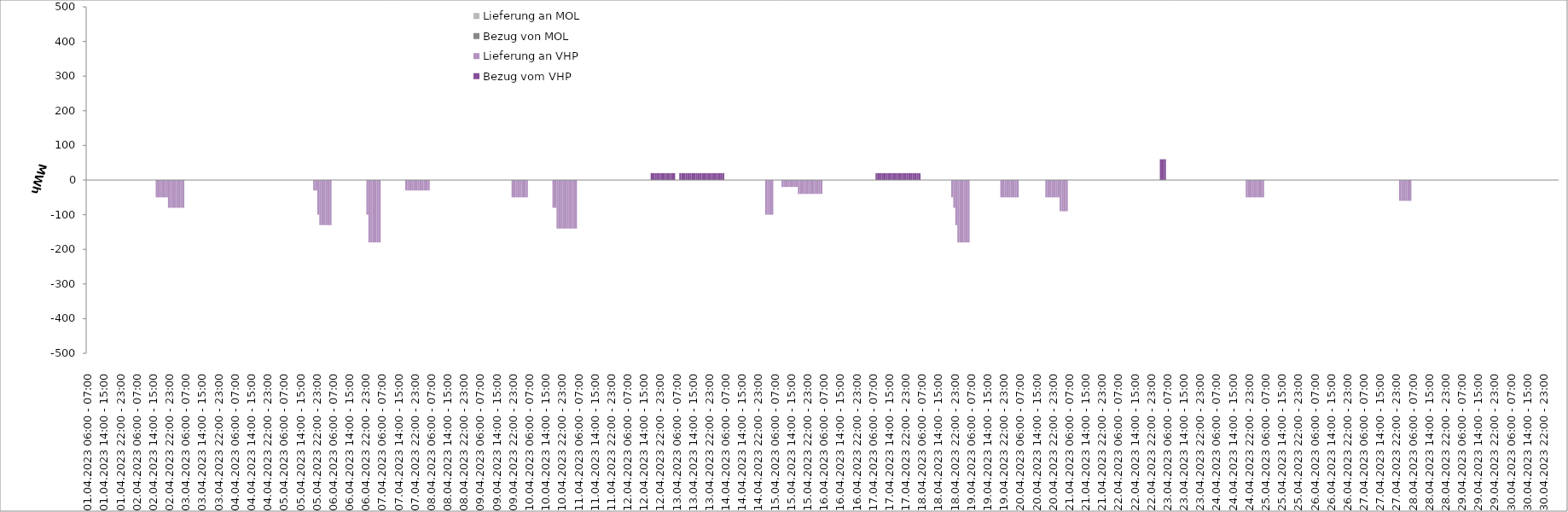
| Category | Bezug vom VHP | Lieferung an VHP | Bezug von MOL | Lieferung an MOL |
|---|---|---|---|---|
| 01.04.2023 06:00 - 07:00 | 0 | 0 | 0 | 0 |
| 01.04.2023 07:00 - 08:00 | 0 | 0 | 0 | 0 |
| 01.04.2023 08:00 - 09:00 | 0 | 0 | 0 | 0 |
| 01.04.2023 09:00 - 10:00 | 0 | 0 | 0 | 0 |
| 01.04.2023 10:00 - 11:00 | 0 | 0 | 0 | 0 |
| 01.04.2023 11:00 - 12:00 | 0 | 0 | 0 | 0 |
| 01.04.2023 12:00 - 13:00 | 0 | 0 | 0 | 0 |
| 01.04.2023 13:00 - 14:00 | 0 | 0 | 0 | 0 |
| 01.04.2023 14:00 - 15:00 | 0 | 0 | 0 | 0 |
| 01.04.2023 15:00 - 16:00 | 0 | 0 | 0 | 0 |
| 01.04.2023 16:00 - 17:00 | 0 | 0 | 0 | 0 |
| 01.04.2023 17:00 - 18:00 | 0 | 0 | 0 | 0 |
| 01.04.2023 18:00 - 19:00 | 0 | 0 | 0 | 0 |
| 01.04.2023 19:00 - 20:00 | 0 | 0 | 0 | 0 |
| 01.04.2023 20:00 - 21:00 | 0 | 0 | 0 | 0 |
| 01.04.2023 21:00 - 22:00 | 0 | 0 | 0 | 0 |
| 01.04.2023 22:00 - 23:00 | 0 | 0 | 0 | 0 |
| 01.04.2023 23:00 - 24:00 | 0 | 0 | 0 | 0 |
| 02.04.2023 00:00 - 01:00 | 0 | 0 | 0 | 0 |
| 02.04.2023 01:00 - 02:00 | 0 | 0 | 0 | 0 |
| 02.04.2023 02:00 - 03:00 | 0 | 0 | 0 | 0 |
| 02.04.2023 03:00 - 04:00 | 0 | 0 | 0 | 0 |
| 02.04.2023 04:00 - 05:00 | 0 | 0 | 0 | 0 |
| 02.04.2023 05:00 - 06:00 | 0 | 0 | 0 | 0 |
| 02.04.2023 06:00 - 07:00 | 0 | 0 | 0 | 0 |
| 02.04.2023 07:00 - 08:00 | 0 | 0 | 0 | 0 |
| 02.04.2023 08:00 - 09:00 | 0 | 0 | 0 | 0 |
| 02.04.2023 09:00 - 10:00 | 0 | 0 | 0 | 0 |
| 02.04.2023 10:00 - 11:00 | 0 | 0 | 0 | 0 |
| 02.04.2023 11:00 - 12:00 | 0 | 0 | 0 | 0 |
| 02.04.2023 12:00 - 13:00 | 0 | 0 | 0 | 0 |
| 02.04.2023 13:00 - 14:00 | 0 | 0 | 0 | 0 |
| 02.04.2023 14:00 - 15:00 | 0 | 0 | 0 | 0 |
| 02.04.2023 15:00 - 16:00 | 0 | 0 | 0 | 0 |
| 02.04.2023 16:00 - 17:00 | 0 | -50 | 0 | 0 |
| 02.04.2023 17:00 - 18:00 | 0 | -50 | 0 | 0 |
| 02.04.2023 18:00 - 19:00 | 0 | -50 | 0 | 0 |
| 02.04.2023 19:00 - 20:00 | 0 | -50 | 0 | 0 |
| 02.04.2023 20:00 - 21:00 | 0 | -50 | 0 | 0 |
| 02.04.2023 21:00 - 22:00 | 0 | -50 | 0 | 0 |
| 02.04.2023 22:00 - 23:00 | 0 | -80 | 0 | 0 |
| 02.04.2023 23:00 - 24:00 | 0 | -80 | 0 | 0 |
| 03.04.2023 00:00 - 01:00 | 0 | -80 | 0 | 0 |
| 03.04.2023 01:00 - 02:00 | 0 | -80 | 0 | 0 |
| 03.04.2023 02:00 - 03:00 | 0 | -80 | 0 | 0 |
| 03.04.2023 03:00 - 04:00 | 0 | -80 | 0 | 0 |
| 03.04.2023 04:00 - 05:00 | 0 | -80 | 0 | 0 |
| 03.04.2023 05:00 - 06:00 | 0 | -80 | 0 | 0 |
| 03.04.2023 06:00 - 07:00 | 0 | 0 | 0 | 0 |
| 03.04.2023 07:00 - 08:00 | 0 | 0 | 0 | 0 |
| 03.04.2023 08:00 - 09:00 | 0 | 0 | 0 | 0 |
| 03.04.2023 09:00 - 10:00 | 0 | 0 | 0 | 0 |
| 03.04.2023 10:00 - 11:00 | 0 | 0 | 0 | 0 |
| 03.04.2023 11:00 - 12:00 | 0 | 0 | 0 | 0 |
| 03.04.2023 12:00 - 13:00 | 0 | 0 | 0 | 0 |
| 03.04.2023 13:00 - 14:00 | 0 | 0 | 0 | 0 |
| 03.04.2023 14:00 - 15:00 | 0 | 0 | 0 | 0 |
| 03.04.2023 15:00 - 16:00 | 0 | 0 | 0 | 0 |
| 03.04.2023 16:00 - 17:00 | 0 | 0 | 0 | 0 |
| 03.04.2023 17:00 - 18:00 | 0 | 0 | 0 | 0 |
| 03.04.2023 18:00 - 19:00 | 0 | 0 | 0 | 0 |
| 03.04.2023 19:00 - 20:00 | 0 | 0 | 0 | 0 |
| 03.04.2023 20:00 - 21:00 | 0 | 0 | 0 | 0 |
| 03.04.2023 21:00 - 22:00 | 0 | 0 | 0 | 0 |
| 03.04.2023 22:00 - 23:00 | 0 | 0 | 0 | 0 |
| 03.04.2023 23:00 - 24:00 | 0 | 0 | 0 | 0 |
| 04.04.2023 00:00 - 01:00 | 0 | 0 | 0 | 0 |
| 04.04.2023 01:00 - 02:00 | 0 | 0 | 0 | 0 |
| 04.04.2023 02:00 - 03:00 | 0 | 0 | 0 | 0 |
| 04.04.2023 03:00 - 04:00 | 0 | 0 | 0 | 0 |
| 04.04.2023 04:00 - 05:00 | 0 | 0 | 0 | 0 |
| 04.04.2023 05:00 - 06:00 | 0 | 0 | 0 | 0 |
| 04.04.2023 06:00 - 07:00 | 0 | 0 | 0 | 0 |
| 04.04.2023 07:00 - 08:00 | 0 | 0 | 0 | 0 |
| 04.04.2023 08:00 - 09:00 | 0 | 0 | 0 | 0 |
| 04.04.2023 09:00 - 10:00 | 0 | 0 | 0 | 0 |
| 04.04.2023 10:00 - 11:00 | 0 | 0 | 0 | 0 |
| 04.04.2023 11:00 - 12:00 | 0 | 0 | 0 | 0 |
| 04.04.2023 12:00 - 13:00 | 0 | 0 | 0 | 0 |
| 04.04.2023 13:00 - 14:00 | 0 | 0 | 0 | 0 |
| 04.04.2023 14:00 - 15:00 | 0 | 0 | 0 | 0 |
| 04.04.2023 15:00 - 16:00 | 0 | 0 | 0 | 0 |
| 04.04.2023 16:00 - 17:00 | 0 | 0 | 0 | 0 |
| 04.04.2023 17:00 - 18:00 | 0 | 0 | 0 | 0 |
| 04.04.2023 18:00 - 19:00 | 0 | 0 | 0 | 0 |
| 04.04.2023 19:00 - 20:00 | 0 | 0 | 0 | 0 |
| 04.04.2023 20:00 - 21:00 | 0 | 0 | 0 | 0 |
| 04.04.2023 21:00 - 22:00 | 0 | 0 | 0 | 0 |
| 04.04.2023 22:00 - 23:00 | 0 | 0 | 0 | 0 |
| 04.04.2023 23:00 - 24:00 | 0 | 0 | 0 | 0 |
| 05.04.2023 00:00 - 01:00 | 0 | 0 | 0 | 0 |
| 05.04.2023 01:00 - 02:00 | 0 | 0 | 0 | 0 |
| 05.04.2023 02:00 - 03:00 | 0 | 0 | 0 | 0 |
| 05.04.2023 03:00 - 04:00 | 0 | 0 | 0 | 0 |
| 05.04.2023 04:00 - 05:00 | 0 | 0 | 0 | 0 |
| 05.04.2023 05:00 - 06:00 | 0 | 0 | 0 | 0 |
| 05.04.2023 06:00 - 07:00 | 0 | 0 | 0 | 0 |
| 05.04.2023 07:00 - 08:00 | 0 | 0 | 0 | 0 |
| 05.04.2023 08:00 - 09:00 | 0 | 0 | 0 | 0 |
| 05.04.2023 09:00 - 10:00 | 0 | 0 | 0 | 0 |
| 05.04.2023 10:00 - 11:00 | 0 | 0 | 0 | 0 |
| 05.04.2023 11:00 - 12:00 | 0 | 0 | 0 | 0 |
| 05.04.2023 12:00 - 13:00 | 0 | 0 | 0 | 0 |
| 05.04.2023 13:00 - 14:00 | 0 | 0 | 0 | 0 |
| 05.04.2023 14:00 - 15:00 | 0 | 0 | 0 | 0 |
| 05.04.2023 15:00 - 16:00 | 0 | 0 | 0 | 0 |
| 05.04.2023 16:00 - 17:00 | 0 | 0 | 0 | 0 |
| 05.04.2023 17:00 - 18:00 | 0 | 0 | 0 | 0 |
| 05.04.2023 18:00 - 19:00 | 0 | 0 | 0 | 0 |
| 05.04.2023 19:00 - 20:00 | 0 | 0 | 0 | 0 |
| 05.04.2023 20:00 - 21:00 | 0 | 0 | 0 | 0 |
| 05.04.2023 21:00 - 22:00 | 0 | -30 | 0 | 0 |
| 05.04.2023 22:00 - 23:00 | 0 | -30 | 0 | 0 |
| 05.04.2023 23:00 - 24:00 | 0 | -100 | 0 | 0 |
| 06.04.2023 00:00 - 01:00 | 0 | -130 | 0 | 0 |
| 06.04.2023 01:00 - 02:00 | 0 | -130 | 0 | 0 |
| 06.04.2023 02:00 - 03:00 | 0 | -130 | 0 | 0 |
| 06.04.2023 03:00 - 04:00 | 0 | -130 | 0 | 0 |
| 06.04.2023 04:00 - 05:00 | 0 | -130 | 0 | 0 |
| 06.04.2023 05:00 - 06:00 | 0 | -130 | 0 | 0 |
| 06.04.2023 06:00 - 07:00 | 0 | 0 | 0 | 0 |
| 06.04.2023 07:00 - 08:00 | 0 | 0 | 0 | 0 |
| 06.04.2023 08:00 - 09:00 | 0 | 0 | 0 | 0 |
| 06.04.2023 09:00 - 10:00 | 0 | 0 | 0 | 0 |
| 06.04.2023 10:00 - 11:00 | 0 | 0 | 0 | 0 |
| 06.04.2023 11:00 - 12:00 | 0 | 0 | 0 | 0 |
| 06.04.2023 12:00 - 13:00 | 0 | 0 | 0 | 0 |
| 06.04.2023 13:00 - 14:00 | 0 | 0 | 0 | 0 |
| 06.04.2023 14:00 - 15:00 | 0 | 0 | 0 | 0 |
| 06.04.2023 15:00 - 16:00 | 0 | 0 | 0 | 0 |
| 06.04.2023 16:00 - 17:00 | 0 | 0 | 0 | 0 |
| 06.04.2023 17:00 - 18:00 | 0 | 0 | 0 | 0 |
| 06.04.2023 18:00 - 19:00 | 0 | 0 | 0 | 0 |
| 06.04.2023 19:00 - 20:00 | 0 | 0 | 0 | 0 |
| 06.04.2023 20:00 - 21:00 | 0 | 0 | 0 | 0 |
| 06.04.2023 21:00 - 22:00 | 0 | 0 | 0 | 0 |
| 06.04.2023 22:00 - 23:00 | 0 | 0 | 0 | 0 |
| 06.04.2023 23:00 - 24:00 | 0 | -100 | 0 | 0 |
| 07.04.2023 00:00 - 01:00 | 0 | -180 | 0 | 0 |
| 07.04.2023 01:00 - 02:00 | 0 | -180 | 0 | 0 |
| 07.04.2023 02:00 - 03:00 | 0 | -180 | 0 | 0 |
| 07.04.2023 03:00 - 04:00 | 0 | -180 | 0 | 0 |
| 07.04.2023 04:00 - 05:00 | 0 | -180 | 0 | 0 |
| 07.04.2023 05:00 - 06:00 | 0 | -180 | 0 | 0 |
| 07.04.2023 06:00 - 07:00 | 0 | 0 | 0 | 0 |
| 07.04.2023 07:00 - 08:00 | 0 | 0 | 0 | 0 |
| 07.04.2023 08:00 - 09:00 | 0 | 0 | 0 | 0 |
| 07.04.2023 09:00 - 10:00 | 0 | 0 | 0 | 0 |
| 07.04.2023 10:00 - 11:00 | 0 | 0 | 0 | 0 |
| 07.04.2023 11:00 - 12:00 | 0 | 0 | 0 | 0 |
| 07.04.2023 12:00 - 13:00 | 0 | 0 | 0 | 0 |
| 07.04.2023 13:00 - 14:00 | 0 | 0 | 0 | 0 |
| 07.04.2023 14:00 - 15:00 | 0 | 0 | 0 | 0 |
| 07.04.2023 15:00 - 16:00 | 0 | 0 | 0 | 0 |
| 07.04.2023 16:00 - 17:00 | 0 | 0 | 0 | 0 |
| 07.04.2023 17:00 - 18:00 | 0 | 0 | 0 | 0 |
| 07.04.2023 18:00 - 19:00 | 0 | -30 | 0 | 0 |
| 07.04.2023 19:00 - 20:00 | 0 | -30 | 0 | 0 |
| 07.04.2023 20:00 - 21:00 | 0 | -30 | 0 | 0 |
| 07.04.2023 21:00 - 22:00 | 0 | -30 | 0 | 0 |
| 07.04.2023 22:00 - 23:00 | 0 | -30 | 0 | 0 |
| 07.04.2023 23:00 - 24:00 | 0 | -30 | 0 | 0 |
| 08.04.2023 00:00 - 01:00 | 0 | -30 | 0 | 0 |
| 08.04.2023 01:00 - 02:00 | 0 | -30 | 0 | 0 |
| 08.04.2023 02:00 - 03:00 | 0 | -30 | 0 | 0 |
| 08.04.2023 03:00 - 04:00 | 0 | -30 | 0 | 0 |
| 08.04.2023 04:00 - 05:00 | 0 | -30 | 0 | 0 |
| 08.04.2023 05:00 - 06:00 | 0 | -30 | 0 | 0 |
| 08.04.2023 06:00 - 07:00 | 0 | 0 | 0 | 0 |
| 08.04.2023 07:00 - 08:00 | 0 | 0 | 0 | 0 |
| 08.04.2023 08:00 - 09:00 | 0 | 0 | 0 | 0 |
| 08.04.2023 09:00 - 10:00 | 0 | 0 | 0 | 0 |
| 08.04.2023 10:00 - 11:00 | 0 | 0 | 0 | 0 |
| 08.04.2023 11:00 - 12:00 | 0 | 0 | 0 | 0 |
| 08.04.2023 12:00 - 13:00 | 0 | 0 | 0 | 0 |
| 08.04.2023 13:00 - 14:00 | 0 | 0 | 0 | 0 |
| 08.04.2023 14:00 - 15:00 | 0 | 0 | 0 | 0 |
| 08.04.2023 15:00 - 16:00 | 0 | 0 | 0 | 0 |
| 08.04.2023 16:00 - 17:00 | 0 | 0 | 0 | 0 |
| 08.04.2023 17:00 - 18:00 | 0 | 0 | 0 | 0 |
| 08.04.2023 18:00 - 19:00 | 0 | 0 | 0 | 0 |
| 08.04.2023 19:00 - 20:00 | 0 | 0 | 0 | 0 |
| 08.04.2023 20:00 - 21:00 | 0 | 0 | 0 | 0 |
| 08.04.2023 21:00 - 22:00 | 0 | 0 | 0 | 0 |
| 08.04.2023 22:00 - 23:00 | 0 | 0 | 0 | 0 |
| 08.04.2023 23:00 - 24:00 | 0 | 0 | 0 | 0 |
| 09.04.2023 00:00 - 01:00 | 0 | 0 | 0 | 0 |
| 09.04.2023 01:00 - 02:00 | 0 | 0 | 0 | 0 |
| 09.04.2023 02:00 - 03:00 | 0 | 0 | 0 | 0 |
| 09.04.2023 03:00 - 04:00 | 0 | 0 | 0 | 0 |
| 09.04.2023 04:00 - 05:00 | 0 | 0 | 0 | 0 |
| 09.04.2023 05:00 - 06:00 | 0 | 0 | 0 | 0 |
| 09.04.2023 06:00 - 07:00 | 0 | 0 | 0 | 0 |
| 09.04.2023 07:00 - 08:00 | 0 | 0 | 0 | 0 |
| 09.04.2023 08:00 - 09:00 | 0 | 0 | 0 | 0 |
| 09.04.2023 09:00 - 10:00 | 0 | 0 | 0 | 0 |
| 09.04.2023 10:00 - 11:00 | 0 | 0 | 0 | 0 |
| 09.04.2023 11:00 - 12:00 | 0 | 0 | 0 | 0 |
| 09.04.2023 12:00 - 13:00 | 0 | 0 | 0 | 0 |
| 09.04.2023 13:00 - 14:00 | 0 | 0 | 0 | 0 |
| 09.04.2023 14:00 - 15:00 | 0 | 0 | 0 | 0 |
| 09.04.2023 15:00 - 16:00 | 0 | 0 | 0 | 0 |
| 09.04.2023 16:00 - 17:00 | 0 | 0 | 0 | 0 |
| 09.04.2023 17:00 - 18:00 | 0 | 0 | 0 | 0 |
| 09.04.2023 18:00 - 19:00 | 0 | 0 | 0 | 0 |
| 09.04.2023 19:00 - 20:00 | 0 | 0 | 0 | 0 |
| 09.04.2023 20:00 - 21:00 | 0 | 0 | 0 | 0 |
| 09.04.2023 21:00 - 22:00 | 0 | 0 | 0 | 0 |
| 09.04.2023 22:00 - 23:00 | 0 | -50 | 0 | 0 |
| 09.04.2023 23:00 - 24:00 | 0 | -50 | 0 | 0 |
| 10.04.2023 00:00 - 01:00 | 0 | -50 | 0 | 0 |
| 10.04.2023 01:00 - 02:00 | 0 | -50 | 0 | 0 |
| 10.04.2023 02:00 - 03:00 | 0 | -50 | 0 | 0 |
| 10.04.2023 03:00 - 04:00 | 0 | -50 | 0 | 0 |
| 10.04.2023 04:00 - 05:00 | 0 | -50 | 0 | 0 |
| 10.04.2023 05:00 - 06:00 | 0 | -50 | 0 | 0 |
| 10.04.2023 06:00 - 07:00 | 0 | 0 | 0 | 0 |
| 10.04.2023 07:00 - 08:00 | 0 | 0 | 0 | 0 |
| 10.04.2023 08:00 - 09:00 | 0 | 0 | 0 | 0 |
| 10.04.2023 09:00 - 10:00 | 0 | 0 | 0 | 0 |
| 10.04.2023 10:00 - 11:00 | 0 | 0 | 0 | 0 |
| 10.04.2023 11:00 - 12:00 | 0 | 0 | 0 | 0 |
| 10.04.2023 12:00 - 13:00 | 0 | 0 | 0 | 0 |
| 10.04.2023 13:00 - 14:00 | 0 | 0 | 0 | 0 |
| 10.04.2023 14:00 - 15:00 | 0 | 0 | 0 | 0 |
| 10.04.2023 15:00 - 16:00 | 0 | 0 | 0 | 0 |
| 10.04.2023 16:00 - 17:00 | 0 | 0 | 0 | 0 |
| 10.04.2023 17:00 - 18:00 | 0 | 0 | 0 | 0 |
| 10.04.2023 18:00 - 19:00 | 0 | -80 | 0 | 0 |
| 10.04.2023 19:00 - 20:00 | 0 | -80 | 0 | 0 |
| 10.04.2023 20:00 - 21:00 | 0 | -140 | 0 | 0 |
| 10.04.2023 21:00 - 22:00 | 0 | -140 | 0 | 0 |
| 10.04.2023 22:00 - 23:00 | 0 | -140 | 0 | 0 |
| 10.04.2023 23:00 - 24:00 | 0 | -140 | 0 | 0 |
| 11.04.2023 00:00 - 01:00 | 0 | -140 | 0 | 0 |
| 11.04.2023 01:00 - 02:00 | 0 | -140 | 0 | 0 |
| 11.04.2023 02:00 - 03:00 | 0 | -140 | 0 | 0 |
| 11.04.2023 03:00 - 04:00 | 0 | -140 | 0 | 0 |
| 11.04.2023 04:00 - 05:00 | 0 | -140 | 0 | 0 |
| 11.04.2023 05:00 - 06:00 | 0 | -140 | 0 | 0 |
| 11.04.2023 06:00 - 07:00 | 0 | 0 | 0 | 0 |
| 11.04.2023 07:00 - 08:00 | 0 | 0 | 0 | 0 |
| 11.04.2023 08:00 - 09:00 | 0 | 0 | 0 | 0 |
| 11.04.2023 09:00 - 10:00 | 0 | 0 | 0 | 0 |
| 11.04.2023 10:00 - 11:00 | 0 | 0 | 0 | 0 |
| 11.04.2023 11:00 - 12:00 | 0 | 0 | 0 | 0 |
| 11.04.2023 12:00 - 13:00 | 0 | 0 | 0 | 0 |
| 11.04.2023 13:00 - 14:00 | 0 | 0 | 0 | 0 |
| 11.04.2023 14:00 - 15:00 | 0 | 0 | 0 | 0 |
| 11.04.2023 15:00 - 16:00 | 0 | 0 | 0 | 0 |
| 11.04.2023 16:00 - 17:00 | 0 | 0 | 0 | 0 |
| 11.04.2023 17:00 - 18:00 | 0 | 0 | 0 | 0 |
| 11.04.2023 18:00 - 19:00 | 0 | 0 | 0 | 0 |
| 11.04.2023 19:00 - 20:00 | 0 | 0 | 0 | 0 |
| 11.04.2023 20:00 - 21:00 | 0 | 0 | 0 | 0 |
| 11.04.2023 21:00 - 22:00 | 0 | 0 | 0 | 0 |
| 11.04.2023 22:00 - 23:00 | 0 | 0 | 0 | 0 |
| 11.04.2023 23:00 - 24:00 | 0 | 0 | 0 | 0 |
| 12.04.2023 00:00 - 01:00 | 0 | 0 | 0 | 0 |
| 12.04.2023 01:00 - 02:00 | 0 | 0 | 0 | 0 |
| 12.04.2023 02:00 - 03:00 | 0 | 0 | 0 | 0 |
| 12.04.2023 03:00 - 04:00 | 0 | 0 | 0 | 0 |
| 12.04.2023 04:00 - 05:00 | 0 | 0 | 0 | 0 |
| 12.04.2023 05:00 - 06:00 | 0 | 0 | 0 | 0 |
| 12.04.2023 06:00 - 07:00 | 0 | 0 | 0 | 0 |
| 12.04.2023 07:00 - 08:00 | 0 | 0 | 0 | 0 |
| 12.04.2023 08:00 - 09:00 | 0 | 0 | 0 | 0 |
| 12.04.2023 09:00 - 10:00 | 0 | 0 | 0 | 0 |
| 12.04.2023 10:00 - 11:00 | 0 | 0 | 0 | 0 |
| 12.04.2023 11:00 - 12:00 | 0 | 0 | 0 | 0 |
| 12.04.2023 12:00 - 13:00 | 0 | 0 | 0 | 0 |
| 12.04.2023 13:00 - 14:00 | 0 | 0 | 0 | 0 |
| 12.04.2023 14:00 - 15:00 | 0 | 0 | 0 | 0 |
| 12.04.2023 15:00 - 16:00 | 0 | 0 | 0 | 0 |
| 12.04.2023 16:00 - 17:00 | 0 | 0 | 0 | 0 |
| 12.04.2023 17:00 - 18:00 | 0 | 0 | 0 | 0 |
| 12.04.2023 18:00 - 19:00 | 20 | 0 | 0 | 0 |
| 12.04.2023 19:00 - 20:00 | 20 | 0 | 0 | 0 |
| 12.04.2023 20:00 - 21:00 | 20 | 0 | 0 | 0 |
| 12.04.2023 21:00 - 22:00 | 20 | 0 | 0 | 0 |
| 12.04.2023 22:00 - 23:00 | 20 | 0 | 0 | 0 |
| 12.04.2023 23:00 - 24:00 | 20 | 0 | 0 | 0 |
| 13.04.2023 00:00 - 01:00 | 20 | 0 | 0 | 0 |
| 13.04.2023 01:00 - 02:00 | 20 | 0 | 0 | 0 |
| 13.04.2023 02:00 - 03:00 | 20 | 0 | 0 | 0 |
| 13.04.2023 03:00 - 04:00 | 20 | 0 | 0 | 0 |
| 13.04.2023 04:00 - 05:00 | 20 | 0 | 0 | 0 |
| 13.04.2023 05:00 - 06:00 | 20 | 0 | 0 | 0 |
| 13.04.2023 06:00 - 07:00 | 0 | 0 | 0 | 0 |
| 13.04.2023 07:00 - 08:00 | 0 | 0 | 0 | 0 |
| 13.04.2023 08:00 - 09:00 | 20 | 0 | 0 | 0 |
| 13.04.2023 09:00 - 10:00 | 20 | 0 | 0 | 0 |
| 13.04.2023 10:00 - 11:00 | 20 | 0 | 0 | 0 |
| 13.04.2023 11:00 - 12:00 | 20 | 0 | 0 | 0 |
| 13.04.2023 12:00 - 13:00 | 20 | 0 | 0 | 0 |
| 13.04.2023 13:00 - 14:00 | 20 | 0 | 0 | 0 |
| 13.04.2023 14:00 - 15:00 | 20 | 0 | 0 | 0 |
| 13.04.2023 15:00 - 16:00 | 20 | 0 | 0 | 0 |
| 13.04.2023 16:00 - 17:00 | 20 | 0 | 0 | 0 |
| 13.04.2023 17:00 - 18:00 | 20 | 0 | 0 | 0 |
| 13.04.2023 18:00 - 19:00 | 20 | 0 | 0 | 0 |
| 13.04.2023 19:00 - 20:00 | 20 | 0 | 0 | 0 |
| 13.04.2023 20:00 - 21:00 | 20 | 0 | 0 | 0 |
| 13.04.2023 21:00 - 22:00 | 20 | 0 | 0 | 0 |
| 13.04.2023 22:00 - 23:00 | 20 | 0 | 0 | 0 |
| 13.04.2023 23:00 - 24:00 | 20 | 0 | 0 | 0 |
| 14.04.2023 00:00 - 01:00 | 20 | 0 | 0 | 0 |
| 14.04.2023 01:00 - 02:00 | 20 | 0 | 0 | 0 |
| 14.04.2023 02:00 - 03:00 | 20 | 0 | 0 | 0 |
| 14.04.2023 03:00 - 04:00 | 20 | 0 | 0 | 0 |
| 14.04.2023 04:00 - 05:00 | 20 | 0 | 0 | 0 |
| 14.04.2023 05:00 - 06:00 | 20 | 0 | 0 | 0 |
| 14.04.2023 06:00 - 07:00 | 0 | 0 | 0 | 0 |
| 14.04.2023 07:00 - 08:00 | 0 | 0 | 0 | 0 |
| 14.04.2023 08:00 - 09:00 | 0 | 0 | 0 | 0 |
| 14.04.2023 09:00 - 10:00 | 0 | 0 | 0 | 0 |
| 14.04.2023 10:00 - 11:00 | 0 | 0 | 0 | 0 |
| 14.04.2023 11:00 - 12:00 | 0 | 0 | 0 | 0 |
| 14.04.2023 12:00 - 13:00 | 0 | 0 | 0 | 0 |
| 14.04.2023 13:00 - 14:00 | 0 | 0 | 0 | 0 |
| 14.04.2023 14:00 - 15:00 | 0 | 0 | 0 | 0 |
| 14.04.2023 15:00 - 16:00 | 0 | 0 | 0 | 0 |
| 14.04.2023 16:00 - 17:00 | 0 | 0 | 0 | 0 |
| 14.04.2023 17:00 - 18:00 | 0 | 0 | 0 | 0 |
| 14.04.2023 18:00 - 19:00 | 0 | 0 | 0 | 0 |
| 14.04.2023 19:00 - 20:00 | 0 | 0 | 0 | 0 |
| 14.04.2023 20:00 - 21:00 | 0 | 0 | 0 | 0 |
| 14.04.2023 21:00 - 22:00 | 0 | 0 | 0 | 0 |
| 14.04.2023 22:00 - 23:00 | 0 | 0 | 0 | 0 |
| 14.04.2023 23:00 - 24:00 | 0 | 0 | 0 | 0 |
| 15.04.2023 00:00 - 01:00 | 0 | 0 | 0 | 0 |
| 15.04.2023 01:00 - 02:00 | 0 | 0 | 0 | 0 |
| 15.04.2023 02:00 - 03:00 | 0 | -100 | 0 | 0 |
| 15.04.2023 03:00 - 04:00 | 0 | -100 | 0 | 0 |
| 15.04.2023 04:00 - 05:00 | 0 | -100 | 0 | 0 |
| 15.04.2023 05:00 - 06:00 | 0 | -100 | 0 | 0 |
| 15.04.2023 06:00 - 07:00 | 0 | 0 | 0 | 0 |
| 15.04.2023 07:00 - 08:00 | 0 | 0 | 0 | 0 |
| 15.04.2023 08:00 - 09:00 | 0 | 0 | 0 | 0 |
| 15.04.2023 09:00 - 10:00 | 0 | 0 | 0 | 0 |
| 15.04.2023 10:00 - 11:00 | 0 | -20 | 0 | 0 |
| 15.04.2023 11:00 - 12:00 | 0 | -20 | 0 | 0 |
| 15.04.2023 12:00 - 13:00 | 0 | -20 | 0 | 0 |
| 15.04.2023 13:00 - 14:00 | 0 | -20 | 0 | 0 |
| 15.04.2023 14:00 - 15:00 | 0 | -20 | 0 | 0 |
| 15.04.2023 15:00 - 16:00 | 0 | -20 | 0 | 0 |
| 15.04.2023 16:00 - 17:00 | 0 | -20 | 0 | 0 |
| 15.04.2023 17:00 - 18:00 | 0 | -20 | 0 | 0 |
| 15.04.2023 18:00 - 19:00 | 0 | -40 | 0 | 0 |
| 15.04.2023 19:00 - 20:00 | 0 | -40 | 0 | 0 |
| 15.04.2023 20:00 - 21:00 | 0 | -40 | 0 | 0 |
| 15.04.2023 21:00 - 22:00 | 0 | -40 | 0 | 0 |
| 15.04.2023 22:00 - 23:00 | 0 | -40 | 0 | 0 |
| 15.04.2023 23:00 - 24:00 | 0 | -40 | 0 | 0 |
| 16.04.2023 00:00 - 01:00 | 0 | -40 | 0 | 0 |
| 16.04.2023 01:00 - 02:00 | 0 | -40 | 0 | 0 |
| 16.04.2023 02:00 - 03:00 | 0 | -40 | 0 | 0 |
| 16.04.2023 03:00 - 04:00 | 0 | -40 | 0 | 0 |
| 16.04.2023 04:00 - 05:00 | 0 | -40 | 0 | 0 |
| 16.04.2023 05:00 - 06:00 | 0 | -40 | 0 | 0 |
| 16.04.2023 06:00 - 07:00 | 0 | 0 | 0 | 0 |
| 16.04.2023 07:00 - 08:00 | 0 | 0 | 0 | 0 |
| 16.04.2023 08:00 - 09:00 | 0 | 0 | 0 | 0 |
| 16.04.2023 09:00 - 10:00 | 0 | 0 | 0 | 0 |
| 16.04.2023 10:00 - 11:00 | 0 | 0 | 0 | 0 |
| 16.04.2023 11:00 - 12:00 | 0 | 0 | 0 | 0 |
| 16.04.2023 12:00 - 13:00 | 0 | 0 | 0 | 0 |
| 16.04.2023 13:00 - 14:00 | 0 | 0 | 0 | 0 |
| 16.04.2023 14:00 - 15:00 | 0 | 0 | 0 | 0 |
| 16.04.2023 15:00 - 16:00 | 0 | 0 | 0 | 0 |
| 16.04.2023 16:00 - 17:00 | 0 | 0 | 0 | 0 |
| 16.04.2023 17:00 - 18:00 | 0 | 0 | 0 | 0 |
| 16.04.2023 18:00 - 19:00 | 0 | 0 | 0 | 0 |
| 16.04.2023 19:00 - 20:00 | 0 | 0 | 0 | 0 |
| 16.04.2023 20:00 - 21:00 | 0 | 0 | 0 | 0 |
| 16.04.2023 21:00 - 22:00 | 0 | 0 | 0 | 0 |
| 16.04.2023 22:00 - 23:00 | 0 | 0 | 0 | 0 |
| 16.04.2023 23:00 - 24:00 | 0 | 0 | 0 | 0 |
| 17.04.2023 00:00 - 01:00 | 0 | 0 | 0 | 0 |
| 17.04.2023 01:00 - 02:00 | 0 | 0 | 0 | 0 |
| 17.04.2023 02:00 - 03:00 | 0 | 0 | 0 | 0 |
| 17.04.2023 03:00 - 04:00 | 0 | 0 | 0 | 0 |
| 17.04.2023 04:00 - 05:00 | 0 | 0 | 0 | 0 |
| 17.04.2023 05:00 - 06:00 | 0 | 0 | 0 | 0 |
| 17.04.2023 06:00 - 07:00 | 0 | 0 | 0 | 0 |
| 17.04.2023 07:00 - 08:00 | 0 | 0 | 0 | 0 |
| 17.04.2023 08:00 - 09:00 | 20 | 0 | 0 | 0 |
| 17.04.2023 09:00 - 10:00 | 20 | 0 | 0 | 0 |
| 17.04.2023 10:00 - 11:00 | 20 | 0 | 0 | 0 |
| 17.04.2023 11:00 - 12:00 | 20 | 0 | 0 | 0 |
| 17.04.2023 12:00 - 13:00 | 20 | 0 | 0 | 0 |
| 17.04.2023 13:00 - 14:00 | 20 | 0 | 0 | 0 |
| 17.04.2023 14:00 - 15:00 | 20 | 0 | 0 | 0 |
| 17.04.2023 15:00 - 16:00 | 20 | 0 | 0 | 0 |
| 17.04.2023 16:00 - 17:00 | 20 | 0 | 0 | 0 |
| 17.04.2023 17:00 - 18:00 | 20 | 0 | 0 | 0 |
| 17.04.2023 18:00 - 19:00 | 20 | 0 | 0 | 0 |
| 17.04.2023 19:00 - 20:00 | 20 | 0 | 0 | 0 |
| 17.04.2023 20:00 - 21:00 | 20 | 0 | 0 | 0 |
| 17.04.2023 21:00 - 22:00 | 20 | 0 | 0 | 0 |
| 17.04.2023 22:00 - 23:00 | 20 | 0 | 0 | 0 |
| 17.04.2023 23:00 - 24:00 | 20 | 0 | 0 | 0 |
| 18.04.2023 00:00 - 01:00 | 20 | 0 | 0 | 0 |
| 18.04.2023 01:00 - 02:00 | 20 | 0 | 0 | 0 |
| 18.04.2023 02:00 - 03:00 | 20 | 0 | 0 | 0 |
| 18.04.2023 03:00 - 04:00 | 20 | 0 | 0 | 0 |
| 18.04.2023 04:00 - 05:00 | 20 | 0 | 0 | 0 |
| 18.04.2023 05:00 - 06:00 | 20 | 0 | 0 | 0 |
| 18.04.2023 06:00 - 07:00 | 0 | 0 | 0 | 0 |
| 18.04.2023 07:00 - 08:00 | 0 | 0 | 0 | 0 |
| 18.04.2023 08:00 - 09:00 | 0 | 0 | 0 | 0 |
| 18.04.2023 09:00 - 10:00 | 0 | 0 | 0 | 0 |
| 18.04.2023 10:00 - 11:00 | 0 | 0 | 0 | 0 |
| 18.04.2023 11:00 - 12:00 | 0 | 0 | 0 | 0 |
| 18.04.2023 12:00 - 13:00 | 0 | 0 | 0 | 0 |
| 18.04.2023 13:00 - 14:00 | 0 | 0 | 0 | 0 |
| 18.04.2023 14:00 - 15:00 | 0 | 0 | 0 | 0 |
| 18.04.2023 15:00 - 16:00 | 0 | 0 | 0 | 0 |
| 18.04.2023 16:00 - 17:00 | 0 | 0 | 0 | 0 |
| 18.04.2023 17:00 - 18:00 | 0 | 0 | 0 | 0 |
| 18.04.2023 18:00 - 19:00 | 0 | 0 | 0 | 0 |
| 18.04.2023 19:00 - 20:00 | 0 | 0 | 0 | 0 |
| 18.04.2023 20:00 - 21:00 | 0 | 0 | 0 | 0 |
| 18.04.2023 21:00 - 22:00 | 0 | -50 | 0 | 0 |
| 18.04.2023 22:00 - 23:00 | 0 | -80 | 0 | 0 |
| 18.04.2023 23:00 - 24:00 | 0 | -130 | 0 | 0 |
| 19.04.2023 00:00 - 01:00 | 0 | -180 | 0 | 0 |
| 19.04.2023 01:00 - 02:00 | 0 | -180 | 0 | 0 |
| 19.04.2023 02:00 - 03:00 | 0 | -180 | 0 | 0 |
| 19.04.2023 03:00 - 04:00 | 0 | -180 | 0 | 0 |
| 19.04.2023 04:00 - 05:00 | 0 | -180 | 0 | 0 |
| 19.04.2023 05:00 - 06:00 | 0 | -180 | 0 | 0 |
| 19.04.2023 06:00 - 07:00 | 0 | 0 | 0 | 0 |
| 19.04.2023 07:00 - 08:00 | 0 | 0 | 0 | 0 |
| 19.04.2023 08:00 - 09:00 | 0 | 0 | 0 | 0 |
| 19.04.2023 09:00 - 10:00 | 0 | 0 | 0 | 0 |
| 19.04.2023 10:00 - 11:00 | 0 | 0 | 0 | 0 |
| 19.04.2023 11:00 - 12:00 | 0 | 0 | 0 | 0 |
| 19.04.2023 12:00 - 13:00 | 0 | 0 | 0 | 0 |
| 19.04.2023 13:00 - 14:00 | 0 | 0 | 0 | 0 |
| 19.04.2023 14:00 - 15:00 | 0 | 0 | 0 | 0 |
| 19.04.2023 15:00 - 16:00 | 0 | 0 | 0 | 0 |
| 19.04.2023 16:00 - 17:00 | 0 | 0 | 0 | 0 |
| 19.04.2023 17:00 - 18:00 | 0 | 0 | 0 | 0 |
| 19.04.2023 18:00 - 19:00 | 0 | 0 | 0 | 0 |
| 19.04.2023 19:00 - 20:00 | 0 | 0 | 0 | 0 |
| 19.04.2023 20:00 - 21:00 | 0 | 0 | 0 | 0 |
| 19.04.2023 21:00 - 22:00 | 0 | -50 | 0 | 0 |
| 19.04.2023 22:00 - 23:00 | 0 | -50 | 0 | 0 |
| 19.04.2023 23:00 - 24:00 | 0 | -50 | 0 | 0 |
| 20.04.2023 00:00 - 01:00 | 0 | -50 | 0 | 0 |
| 20.04.2023 01:00 - 02:00 | 0 | -50 | 0 | 0 |
| 20.04.2023 02:00 - 03:00 | 0 | -50 | 0 | 0 |
| 20.04.2023 03:00 - 04:00 | 0 | -50 | 0 | 0 |
| 20.04.2023 04:00 - 05:00 | 0 | -50 | 0 | 0 |
| 20.04.2023 05:00 - 06:00 | 0 | -50 | 0 | 0 |
| 20.04.2023 06:00 - 07:00 | 0 | 0 | 0 | 0 |
| 20.04.2023 07:00 - 08:00 | 0 | 0 | 0 | 0 |
| 20.04.2023 08:00 - 09:00 | 0 | 0 | 0 | 0 |
| 20.04.2023 09:00 - 10:00 | 0 | 0 | 0 | 0 |
| 20.04.2023 10:00 - 11:00 | 0 | 0 | 0 | 0 |
| 20.04.2023 11:00 - 12:00 | 0 | 0 | 0 | 0 |
| 20.04.2023 12:00 - 13:00 | 0 | 0 | 0 | 0 |
| 20.04.2023 13:00 - 14:00 | 0 | 0 | 0 | 0 |
| 20.04.2023 14:00 - 15:00 | 0 | 0 | 0 | 0 |
| 20.04.2023 15:00 - 16:00 | 0 | 0 | 0 | 0 |
| 20.04.2023 16:00 - 17:00 | 0 | 0 | 0 | 0 |
| 20.04.2023 17:00 - 18:00 | 0 | 0 | 0 | 0 |
| 20.04.2023 18:00 - 19:00 | 0 | 0 | 0 | 0 |
| 20.04.2023 19:00 - 20:00 | 0 | -50 | 0 | 0 |
| 20.04.2023 20:00 - 21:00 | 0 | -50 | 0 | 0 |
| 20.04.2023 21:00 - 22:00 | 0 | -50 | 0 | 0 |
| 20.04.2023 22:00 - 23:00 | 0 | -50 | 0 | 0 |
| 20.04.2023 23:00 - 24:00 | 0 | -50 | 0 | 0 |
| 21.04.2023 00:00 - 01:00 | 0 | -50 | 0 | 0 |
| 21.04.2023 01:00 - 02:00 | 0 | -50 | 0 | 0 |
| 21.04.2023 02:00 - 03:00 | 0 | -90 | 0 | 0 |
| 21.04.2023 03:00 - 04:00 | 0 | -90 | 0 | 0 |
| 21.04.2023 04:00 - 05:00 | 0 | -90 | 0 | 0 |
| 21.04.2023 05:00 - 06:00 | 0 | -90 | 0 | 0 |
| 21.04.2023 06:00 - 07:00 | 0 | 0 | 0 | 0 |
| 21.04.2023 07:00 - 08:00 | 0 | 0 | 0 | 0 |
| 21.04.2023 08:00 - 09:00 | 0 | 0 | 0 | 0 |
| 21.04.2023 09:00 - 10:00 | 0 | 0 | 0 | 0 |
| 21.04.2023 10:00 - 11:00 | 0 | 0 | 0 | 0 |
| 21.04.2023 11:00 - 12:00 | 0 | 0 | 0 | 0 |
| 21.04.2023 12:00 - 13:00 | 0 | 0 | 0 | 0 |
| 21.04.2023 13:00 - 14:00 | 0 | 0 | 0 | 0 |
| 21.04.2023 14:00 - 15:00 | 0 | 0 | 0 | 0 |
| 21.04.2023 15:00 - 16:00 | 0 | 0 | 0 | 0 |
| 21.04.2023 16:00 - 17:00 | 0 | 0 | 0 | 0 |
| 21.04.2023 17:00 - 18:00 | 0 | 0 | 0 | 0 |
| 21.04.2023 18:00 - 19:00 | 0 | 0 | 0 | 0 |
| 21.04.2023 19:00 - 20:00 | 0 | 0 | 0 | 0 |
| 21.04.2023 20:00 - 21:00 | 0 | 0 | 0 | 0 |
| 21.04.2023 21:00 - 22:00 | 0 | 0 | 0 | 0 |
| 21.04.2023 22:00 - 23:00 | 0 | 0 | 0 | 0 |
| 21.04.2023 23:00 - 24:00 | 0 | 0 | 0 | 0 |
| 22.04.2023 00:00 - 01:00 | 0 | 0 | 0 | 0 |
| 22.04.2023 01:00 - 02:00 | 0 | 0 | 0 | 0 |
| 22.04.2023 02:00 - 03:00 | 0 | 0 | 0 | 0 |
| 22.04.2023 03:00 - 04:00 | 0 | 0 | 0 | 0 |
| 22.04.2023 04:00 - 05:00 | 0 | 0 | 0 | 0 |
| 22.04.2023 05:00 - 06:00 | 0 | 0 | 0 | 0 |
| 22.04.2023 06:00 - 07:00 | 0 | 0 | 0 | 0 |
| 22.04.2023 07:00 - 08:00 | 0 | 0 | 0 | 0 |
| 22.04.2023 08:00 - 09:00 | 0 | 0 | 0 | 0 |
| 22.04.2023 09:00 - 10:00 | 0 | 0 | 0 | 0 |
| 22.04.2023 10:00 - 11:00 | 0 | 0 | 0 | 0 |
| 22.04.2023 11:00 - 12:00 | 0 | 0 | 0 | 0 |
| 22.04.2023 12:00 - 13:00 | 0 | 0 | 0 | 0 |
| 22.04.2023 13:00 - 14:00 | 0 | 0 | 0 | 0 |
| 22.04.2023 14:00 - 15:00 | 0 | 0 | 0 | 0 |
| 22.04.2023 15:00 - 16:00 | 0 | 0 | 0 | 0 |
| 22.04.2023 16:00 - 17:00 | 0 | 0 | 0 | 0 |
| 22.04.2023 17:00 - 18:00 | 0 | 0 | 0 | 0 |
| 22.04.2023 18:00 - 19:00 | 0 | 0 | 0 | 0 |
| 22.04.2023 19:00 - 20:00 | 0 | 0 | 0 | 0 |
| 22.04.2023 20:00 - 21:00 | 0 | 0 | 0 | 0 |
| 22.04.2023 21:00 - 22:00 | 0 | 0 | 0 | 0 |
| 22.04.2023 22:00 - 23:00 | 0 | 0 | 0 | 0 |
| 22.04.2023 23:00 - 24:00 | 0 | 0 | 0 | 0 |
| 23.04.2023 00:00 - 01:00 | 0 | 0 | 0 | 0 |
| 23.04.2023 01:00 - 02:00 | 0 | 0 | 0 | 0 |
| 23.04.2023 02:00 - 03:00 | 0 | 0 | 0 | 0 |
| 23.04.2023 03:00 - 04:00 | 60 | 0 | 0 | 0 |
| 23.04.2023 04:00 - 05:00 | 60 | 0 | 0 | 0 |
| 23.04.2023 05:00 - 06:00 | 60 | 0 | 0 | 0 |
| 23.04.2023 06:00 - 07:00 | 0 | 0 | 0 | 0 |
| 23.04.2023 07:00 - 08:00 | 0 | 0 | 0 | 0 |
| 23.04.2023 08:00 - 09:00 | 0 | 0 | 0 | 0 |
| 23.04.2023 09:00 - 10:00 | 0 | 0 | 0 | 0 |
| 23.04.2023 10:00 - 11:00 | 0 | 0 | 0 | 0 |
| 23.04.2023 11:00 - 12:00 | 0 | 0 | 0 | 0 |
| 23.04.2023 12:00 - 13:00 | 0 | 0 | 0 | 0 |
| 23.04.2023 13:00 - 14:00 | 0 | 0 | 0 | 0 |
| 23.04.2023 14:00 - 15:00 | 0 | 0 | 0 | 0 |
| 23.04.2023 15:00 - 16:00 | 0 | 0 | 0 | 0 |
| 23.04.2023 16:00 - 17:00 | 0 | 0 | 0 | 0 |
| 23.04.2023 17:00 - 18:00 | 0 | 0 | 0 | 0 |
| 23.04.2023 18:00 - 19:00 | 0 | 0 | 0 | 0 |
| 23.04.2023 19:00 - 20:00 | 0 | 0 | 0 | 0 |
| 23.04.2023 20:00 - 21:00 | 0 | 0 | 0 | 0 |
| 23.04.2023 21:00 - 22:00 | 0 | 0 | 0 | 0 |
| 23.04.2023 22:00 - 23:00 | 0 | 0 | 0 | 0 |
| 23.04.2023 23:00 - 24:00 | 0 | 0 | 0 | 0 |
| 24.04.2023 00:00 - 01:00 | 0 | 0 | 0 | 0 |
| 24.04.2023 01:00 - 02:00 | 0 | 0 | 0 | 0 |
| 24.04.2023 02:00 - 03:00 | 0 | 0 | 0 | 0 |
| 24.04.2023 03:00 - 04:00 | 0 | 0 | 0 | 0 |
| 24.04.2023 04:00 - 05:00 | 0 | 0 | 0 | 0 |
| 24.04.2023 05:00 - 06:00 | 0 | 0 | 0 | 0 |
| 24.04.2023 06:00 - 07:00 | 0 | 0 | 0 | 0 |
| 24.04.2023 07:00 - 08:00 | 0 | 0 | 0 | 0 |
| 24.04.2023 08:00 - 09:00 | 0 | 0 | 0 | 0 |
| 24.04.2023 09:00 - 10:00 | 0 | 0 | 0 | 0 |
| 24.04.2023 10:00 - 11:00 | 0 | 0 | 0 | 0 |
| 24.04.2023 11:00 - 12:00 | 0 | 0 | 0 | 0 |
| 24.04.2023 12:00 - 13:00 | 0 | 0 | 0 | 0 |
| 24.04.2023 13:00 - 14:00 | 0 | 0 | 0 | 0 |
| 24.04.2023 14:00 - 15:00 | 0 | 0 | 0 | 0 |
| 24.04.2023 15:00 - 16:00 | 0 | 0 | 0 | 0 |
| 24.04.2023 16:00 - 17:00 | 0 | 0 | 0 | 0 |
| 24.04.2023 17:00 - 18:00 | 0 | 0 | 0 | 0 |
| 24.04.2023 18:00 - 19:00 | 0 | 0 | 0 | 0 |
| 24.04.2023 19:00 - 20:00 | 0 | 0 | 0 | 0 |
| 24.04.2023 20:00 - 21:00 | 0 | 0 | 0 | 0 |
| 24.04.2023 21:00 - 22:00 | 0 | -50 | 0 | 0 |
| 24.04.2023 22:00 - 23:00 | 0 | -50 | 0 | 0 |
| 24.04.2023 23:00 - 24:00 | 0 | -50 | 0 | 0 |
| 25.04.2023 00:00 - 01:00 | 0 | -50 | 0 | 0 |
| 25.04.2023 01:00 - 02:00 | 0 | -50 | 0 | 0 |
| 25.04.2023 02:00 - 03:00 | 0 | -50 | 0 | 0 |
| 25.04.2023 03:00 - 04:00 | 0 | -50 | 0 | 0 |
| 25.04.2023 04:00 - 05:00 | 0 | -50 | 0 | 0 |
| 25.04.2023 05:00 - 06:00 | 0 | -50 | 0 | 0 |
| 25.04.2023 06:00 - 07:00 | 0 | 0 | 0 | 0 |
| 25.04.2023 07:00 - 08:00 | 0 | 0 | 0 | 0 |
| 25.04.2023 08:00 - 09:00 | 0 | 0 | 0 | 0 |
| 25.04.2023 09:00 - 10:00 | 0 | 0 | 0 | 0 |
| 25.04.2023 10:00 - 11:00 | 0 | 0 | 0 | 0 |
| 25.04.2023 11:00 - 12:00 | 0 | 0 | 0 | 0 |
| 25.04.2023 12:00 - 13:00 | 0 | 0 | 0 | 0 |
| 25.04.2023 13:00 - 14:00 | 0 | 0 | 0 | 0 |
| 25.04.2023 14:00 - 15:00 | 0 | 0 | 0 | 0 |
| 25.04.2023 15:00 - 16:00 | 0 | 0 | 0 | 0 |
| 25.04.2023 16:00 - 17:00 | 0 | 0 | 0 | 0 |
| 25.04.2023 17:00 - 18:00 | 0 | 0 | 0 | 0 |
| 25.04.2023 18:00 - 19:00 | 0 | 0 | 0 | 0 |
| 25.04.2023 19:00 - 20:00 | 0 | 0 | 0 | 0 |
| 25.04.2023 20:00 - 21:00 | 0 | 0 | 0 | 0 |
| 25.04.2023 21:00 - 22:00 | 0 | 0 | 0 | 0 |
| 25.04.2023 22:00 - 23:00 | 0 | 0 | 0 | 0 |
| 25.04.2023 23:00 - 24:00 | 0 | 0 | 0 | 0 |
| 26.04.2023 00:00 - 01:00 | 0 | 0 | 0 | 0 |
| 26.04.2023 01:00 - 02:00 | 0 | 0 | 0 | 0 |
| 26.04.2023 02:00 - 03:00 | 0 | 0 | 0 | 0 |
| 26.04.2023 03:00 - 04:00 | 0 | 0 | 0 | 0 |
| 26.04.2023 04:00 - 05:00 | 0 | 0 | 0 | 0 |
| 26.04.2023 05:00 - 06:00 | 0 | 0 | 0 | 0 |
| 26.04.2023 06:00 - 07:00 | 0 | 0 | 0 | 0 |
| 26.04.2023 07:00 - 08:00 | 0 | 0 | 0 | 0 |
| 26.04.2023 08:00 - 09:00 | 0 | 0 | 0 | 0 |
| 26.04.2023 09:00 - 10:00 | 0 | 0 | 0 | 0 |
| 26.04.2023 10:00 - 11:00 | 0 | 0 | 0 | 0 |
| 26.04.2023 11:00 - 12:00 | 0 | 0 | 0 | 0 |
| 26.04.2023 12:00 - 13:00 | 0 | 0 | 0 | 0 |
| 26.04.2023 13:00 - 14:00 | 0 | 0 | 0 | 0 |
| 26.04.2023 14:00 - 15:00 | 0 | 0 | 0 | 0 |
| 26.04.2023 15:00 - 16:00 | 0 | 0 | 0 | 0 |
| 26.04.2023 16:00 - 17:00 | 0 | 0 | 0 | 0 |
| 26.04.2023 17:00 - 18:00 | 0 | 0 | 0 | 0 |
| 26.04.2023 18:00 - 19:00 | 0 | 0 | 0 | 0 |
| 26.04.2023 19:00 - 20:00 | 0 | 0 | 0 | 0 |
| 26.04.2023 20:00 - 21:00 | 0 | 0 | 0 | 0 |
| 26.04.2023 21:00 - 22:00 | 0 | 0 | 0 | 0 |
| 26.04.2023 22:00 - 23:00 | 0 | 0 | 0 | 0 |
| 26.04.2023 23:00 - 24:00 | 0 | 0 | 0 | 0 |
| 27.04.2023 00:00 - 01:00 | 0 | 0 | 0 | 0 |
| 27.04.2023 01:00 - 02:00 | 0 | 0 | 0 | 0 |
| 27.04.2023 02:00 - 03:00 | 0 | 0 | 0 | 0 |
| 27.04.2023 03:00 - 04:00 | 0 | 0 | 0 | 0 |
| 27.04.2023 04:00 - 05:00 | 0 | 0 | 0 | 0 |
| 27.04.2023 05:00 - 06:00 | 0 | 0 | 0 | 0 |
| 27.04.2023 06:00 - 07:00 | 0 | 0 | 0 | 0 |
| 27.04.2023 07:00 - 08:00 | 0 | 0 | 0 | 0 |
| 27.04.2023 08:00 - 09:00 | 0 | 0 | 0 | 0 |
| 27.04.2023 09:00 - 10:00 | 0 | 0 | 0 | 0 |
| 27.04.2023 10:00 - 11:00 | 0 | 0 | 0 | 0 |
| 27.04.2023 11:00 - 12:00 | 0 | 0 | 0 | 0 |
| 27.04.2023 12:00 - 13:00 | 0 | 0 | 0 | 0 |
| 27.04.2023 13:00 - 14:00 | 0 | 0 | 0 | 0 |
| 27.04.2023 14:00 - 15:00 | 0 | 0 | 0 | 0 |
| 27.04.2023 15:00 - 16:00 | 0 | 0 | 0 | 0 |
| 27.04.2023 16:00 - 17:00 | 0 | 0 | 0 | 0 |
| 27.04.2023 17:00 - 18:00 | 0 | 0 | 0 | 0 |
| 27.04.2023 18:00 - 19:00 | 0 | 0 | 0 | 0 |
| 27.04.2023 19:00 - 20:00 | 0 | 0 | 0 | 0 |
| 27.04.2023 20:00 - 21:00 | 0 | 0 | 0 | 0 |
| 27.04.2023 21:00 - 22:00 | 0 | 0 | 0 | 0 |
| 27.04.2023 22:00 - 23:00 | 0 | 0 | 0 | 0 |
| 27.04.2023 23:00 - 24:00 | 0 | 0 | 0 | 0 |
| 28.04.2023 00:00 - 01:00 | 0 | -60 | 0 | 0 |
| 28.04.2023 01:00 - 02:00 | 0 | -60 | 0 | 0 |
| 28.04.2023 02:00 - 03:00 | 0 | -60 | 0 | 0 |
| 28.04.2023 03:00 - 04:00 | 0 | -60 | 0 | 0 |
| 28.04.2023 04:00 - 05:00 | 0 | -60 | 0 | 0 |
| 28.04.2023 05:00 - 06:00 | 0 | -60 | 0 | 0 |
| 28.04.2023 06:00 - 07:00 | 0 | 0 | 0 | 0 |
| 28.04.2023 07:00 - 08:00 | 0 | 0 | 0 | 0 |
| 28.04.2023 08:00 - 09:00 | 0 | 0 | 0 | 0 |
| 28.04.2023 09:00 - 10:00 | 0 | 0 | 0 | 0 |
| 28.04.2023 10:00 - 11:00 | 0 | 0 | 0 | 0 |
| 28.04.2023 11:00 - 12:00 | 0 | 0 | 0 | 0 |
| 28.04.2023 12:00 - 13:00 | 0 | 0 | 0 | 0 |
| 28.04.2023 13:00 - 14:00 | 0 | 0 | 0 | 0 |
| 28.04.2023 14:00 - 15:00 | 0 | 0 | 0 | 0 |
| 28.04.2023 15:00 - 16:00 | 0 | 0 | 0 | 0 |
| 28.04.2023 16:00 - 17:00 | 0 | 0 | 0 | 0 |
| 28.04.2023 17:00 - 18:00 | 0 | 0 | 0 | 0 |
| 28.04.2023 18:00 - 19:00 | 0 | 0 | 0 | 0 |
| 28.04.2023 19:00 - 20:00 | 0 | 0 | 0 | 0 |
| 28.04.2023 20:00 - 21:00 | 0 | 0 | 0 | 0 |
| 28.04.2023 21:00 - 22:00 | 0 | 0 | 0 | 0 |
| 28.04.2023 22:00 - 23:00 | 0 | 0 | 0 | 0 |
| 28.04.2023 23:00 - 24:00 | 0 | 0 | 0 | 0 |
| 29.04.2023 00:00 - 01:00 | 0 | 0 | 0 | 0 |
| 29.04.2023 01:00 - 02:00 | 0 | 0 | 0 | 0 |
| 29.04.2023 02:00 - 03:00 | 0 | 0 | 0 | 0 |
| 29.04.2023 03:00 - 04:00 | 0 | 0 | 0 | 0 |
| 29.04.2023 04:00 - 05:00 | 0 | 0 | 0 | 0 |
| 29.04.2023 05:00 - 06:00 | 0 | 0 | 0 | 0 |
| 29.04.2023 06:00 - 07:00 | 0 | 0 | 0 | 0 |
| 29.04.2023 07:00 - 08:00 | 0 | 0 | 0 | 0 |
| 29.04.2023 08:00 - 09:00 | 0 | 0 | 0 | 0 |
| 29.04.2023 09:00 - 10:00 | 0 | 0 | 0 | 0 |
| 29.04.2023 10:00 - 11:00 | 0 | 0 | 0 | 0 |
| 29.04.2023 11:00 - 12:00 | 0 | 0 | 0 | 0 |
| 29.04.2023 12:00 - 13:00 | 0 | 0 | 0 | 0 |
| 29.04.2023 13:00 - 14:00 | 0 | 0 | 0 | 0 |
| 29.04.2023 14:00 - 15:00 | 0 | 0 | 0 | 0 |
| 29.04.2023 15:00 - 16:00 | 0 | 0 | 0 | 0 |
| 29.04.2023 16:00 - 17:00 | 0 | 0 | 0 | 0 |
| 29.04.2023 17:00 - 18:00 | 0 | 0 | 0 | 0 |
| 29.04.2023 18:00 - 19:00 | 0 | 0 | 0 | 0 |
| 29.04.2023 19:00 - 20:00 | 0 | 0 | 0 | 0 |
| 29.04.2023 20:00 - 21:00 | 0 | 0 | 0 | 0 |
| 29.04.2023 21:00 - 22:00 | 0 | 0 | 0 | 0 |
| 29.04.2023 22:00 - 23:00 | 0 | 0 | 0 | 0 |
| 29.04.2023 23:00 - 24:00 | 0 | 0 | 0 | 0 |
| 30.04.2023 00:00 - 01:00 | 0 | 0 | 0 | 0 |
| 30.04.2023 01:00 - 02:00 | 0 | 0 | 0 | 0 |
| 30.04.2023 02:00 - 03:00 | 0 | 0 | 0 | 0 |
| 30.04.2023 03:00 - 04:00 | 0 | 0 | 0 | 0 |
| 30.04.2023 04:00 - 05:00 | 0 | 0 | 0 | 0 |
| 30.04.2023 05:00 - 06:00 | 0 | 0 | 0 | 0 |
| 30.04.2023 06:00 - 07:00 | 0 | 0 | 0 | 0 |
| 30.04.2023 07:00 - 08:00 | 0 | 0 | 0 | 0 |
| 30.04.2023 08:00 - 09:00 | 0 | 0 | 0 | 0 |
| 30.04.2023 09:00 - 10:00 | 0 | 0 | 0 | 0 |
| 30.04.2023 10:00 - 11:00 | 0 | 0 | 0 | 0 |
| 30.04.2023 11:00 - 12:00 | 0 | 0 | 0 | 0 |
| 30.04.2023 12:00 - 13:00 | 0 | 0 | 0 | 0 |
| 30.04.2023 13:00 - 14:00 | 0 | 0 | 0 | 0 |
| 30.04.2023 14:00 - 15:00 | 0 | 0 | 0 | 0 |
| 30.04.2023 15:00 - 16:00 | 0 | 0 | 0 | 0 |
| 30.04.2023 16:00 - 17:00 | 0 | 0 | 0 | 0 |
| 30.04.2023 17:00 - 18:00 | 0 | 0 | 0 | 0 |
| 30.04.2023 18:00 - 19:00 | 0 | 0 | 0 | 0 |
| 30.04.2023 19:00 - 20:00 | 0 | 0 | 0 | 0 |
| 30.04.2023 20:00 - 21:00 | 0 | 0 | 0 | 0 |
| 30.04.2023 21:00 - 22:00 | 0 | 0 | 0 | 0 |
| 30.04.2023 22:00 - 23:00 | 0 | 0 | 0 | 0 |
| 30.04.2023 23:00 - 24:00 | 0 | 0 | 0 | 0 |
| 01.05.2023 00:00 - 01:00 | 0 | 0 | 0 | 0 |
| 01.05.2023 01:00 - 02:00 | 0 | 0 | 0 | 0 |
| 01.05.2023 02:00 - 03:00 | 0 | 0 | 0 | 0 |
| 01.05.2023 03:00 - 04:00 | 0 | 0 | 0 | 0 |
| 01.05.2023 04:00 - 05:00 | 0 | 0 | 0 | 0 |
| 01.05.2023 05:00 - 06:00 | 0 | 0 | 0 | 0 |